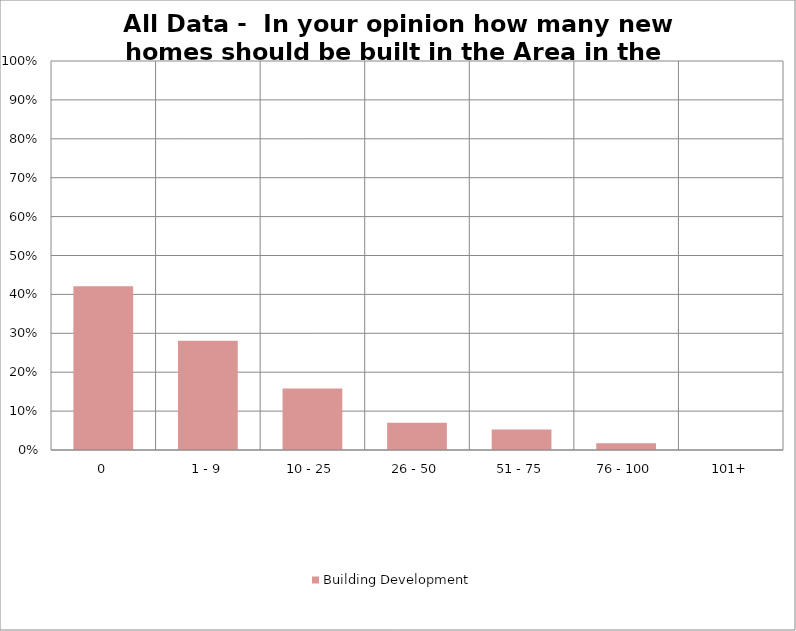
| Category | Building Development |
|---|---|
| 0 | 0.421 |
| 1 - 9 | 0.281 |
| 10 - 25 | 0.158 |
| 26 - 50 | 0.07 |
| 51 - 75 | 0.053 |
| 76 - 100 | 0.018 |
| 101+ | 0 |